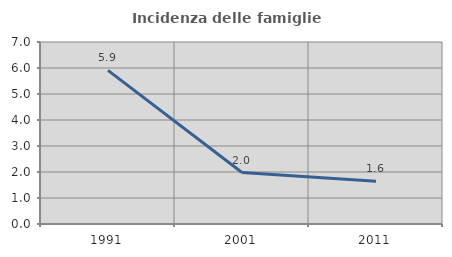
| Category | Incidenza delle famiglie numerose |
|---|---|
| 1991.0 | 5.909 |
| 2001.0 | 1.979 |
| 2011.0 | 1.641 |